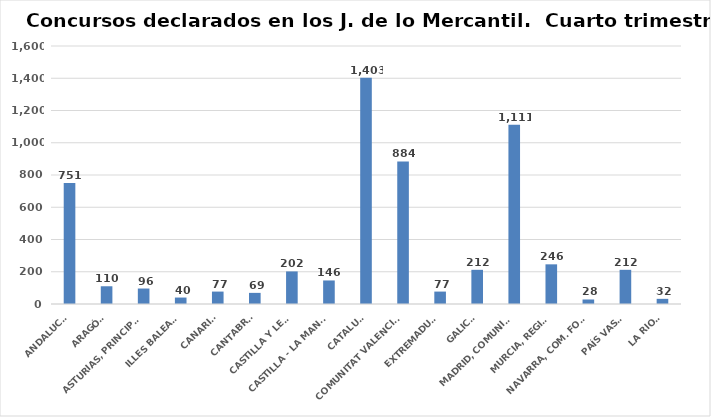
| Category | Series 0 |
|---|---|
| ANDALUCÍA | 751 |
| ARAGÓN | 110 |
| ASTURIAS, PRINCIPADO | 96 |
| ILLES BALEARS | 40 |
| CANARIAS | 77 |
| CANTABRIA | 69 |
| CASTILLA Y LEÓN | 202 |
| CASTILLA - LA MANCHA | 146 |
| CATALUÑA | 1403 |
| COMUNITAT VALENCIANA | 884 |
| EXTREMADURA | 77 |
| GALICIA | 212 |
| MADRID, COMUNIDAD | 1111 |
| MURCIA, REGIÓN | 246 |
| NAVARRA, COM. FORAL | 28 |
| PAÍS VASCO | 212 |
| LA RIOJA | 32 |